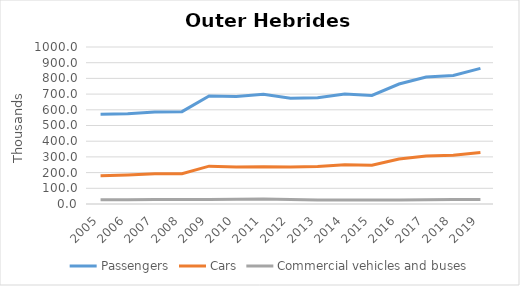
| Category | Passengers | Cars | Commercial vehicles and buses |
|---|---|---|---|
| 2005.0 | 572.269 | 180.241 | 26.97 |
| 2006.0 | 575.164 | 184.348 | 27.351 |
| 2007.0 | 586.705 | 192.025 | 27.905 |
| 2008.0 | 588.12 | 192.684 | 28.086 |
| 2009.0 | 688.514 | 241.152 | 29.419 |
| 2010.0 | 684.53 | 235.005 | 30.354 |
| 2011.0 | 698.529 | 238.037 | 32.385 |
| 2012.0 | 673.899 | 234.919 | 28.152 |
| 2013.0 | 676.269 | 238.966 | 26.03 |
| 2014.0 | 700.2 | 249.6 | 26.14 |
| 2015.0 | 691.5 | 247.3 | 25.53 |
| 2016.0 | 764.36 | 287.087 | 25.795 |
| 2017.0 | 808.5 | 305.7 | 27.7 |
| 2018.0 | 818.2 | 309.9 | 28.2 |
| 2019.0 | 864.1 | 328.2 | 28.8 |